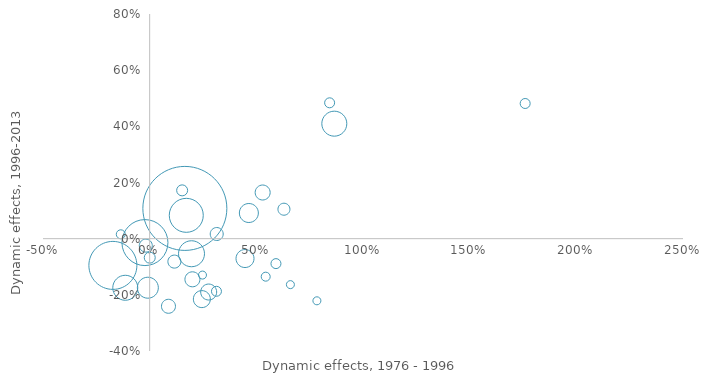
| Category | Series 0 |
|---|---|
| 0.2001666 | -0.144 |
| 0.1649405 | 0.108 |
| 0.1696795 | 0.085 |
| 0.8653374 | 0.41 |
| 0.2766071 | -0.19 |
| 0.1144987 | -0.081 |
| 0.1939089 | -0.052 |
| 0.4450228 | -0.069 |
| 0.0866553 | -0.24 |
| -0.0094689 | -0.174 |
| -0.1736245 | -0.094 |
| 0.4638047 | 0.092 |
| -0.02269 | -0.014 |
| -0.1154066 | -0.174 |
| 0.2435037 | -0.214 |
| 0.5273784 | 0.166 |
| 0.3142682 | 0.017 |
| 0.6576281 | -0.162 |
| 0.6272822 | 0.107 |
| 0.5907217 | -0.088 |
| 0.7834706 | -0.221 |
| 0.5434141 | -0.135 |
| 0.3107836 | -0.186 |
| -0.0015035 | -0.066 |
| 0.246085 | -0.129 |
| 0.1509522 | 0.173 |
| -0.019641 | -0.024 |
| -0.137407 | 0.017 |
| 0.8416304 | 0.485 |
| 1.758454 | 0.483 |